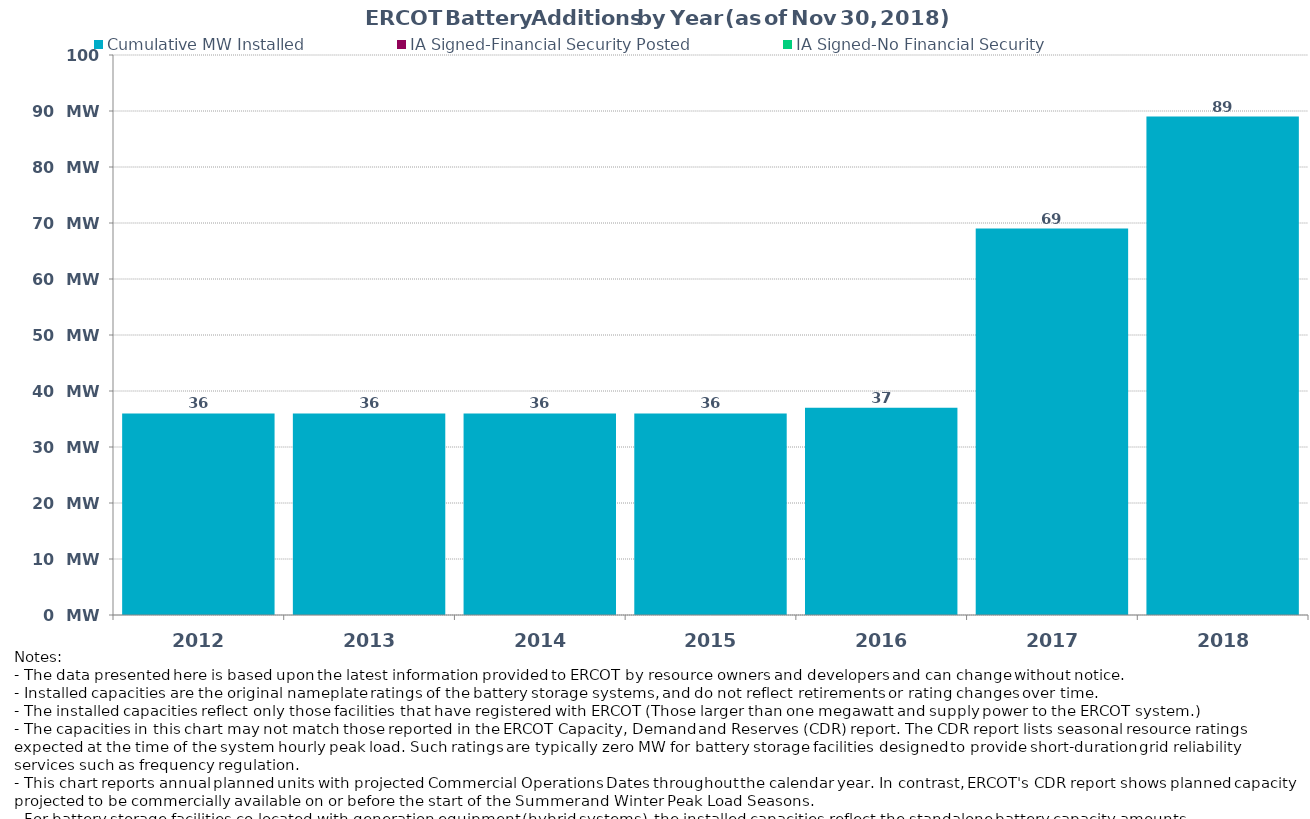
| Category | Cumulative MW Installed | IA Signed-Financial Security Posted  | IA Signed-No Financial Security  | Cumulative Installed and Planned |
|---|---|---|---|---|
| 2012.0 | 36 | 0 | 0 | 36 |
| 2013.0 | 36 | 0 | 0 | 36 |
| 2014.0 | 36 | 0 | 0 | 36 |
| 2015.0 | 36 | 0 | 0 | 36 |
| 2016.0 | 37 | 0 | 0 | 37 |
| 2017.0 | 69 | 0 | 0 | 69 |
| 2018.0 | 89 | 0 | 0 | 89 |